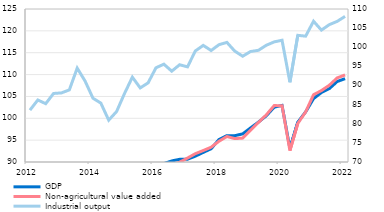
| Category | GDP | Non-agricultural value added |
|---|---|---|
| 2012 | 84.024 | 84.494 |
| II | 85.251 | 85.857 |
| III | 84.299 | 84.659 |
| IV | 84.139 | 84.858 |
| 2013 | 86.026 | 86.24 |
| II | 86.173 | 85.95 |
| III | 87.889 | 88.328 |
| IV | 87.227 | 87.378 |
| 2014 | 86.15 | 86.04 |
| II | 85.49 | 85.033 |
| III | 84.574 | 84.08 |
| IV | 85.877 | 85.282 |
| 2015 | 86.251 | 86.137 |
| II | 87.022 | 86.937 |
| III | 86.911 | 87.029 |
| IV | 87.906 | 88.071 |
| 2016 | 89.156 | 88.746 |
| II | 89.647 | 89.092 |
| III | 90.243 | 89.356 |
| IV | 90.611 | 89.952 |
| 2017 | 90.63 | 90.897 |
| II | 91.344 | 91.908 |
| III | 92.197 | 92.623 |
| IV | 93.033 | 93.385 |
| 2018 | 95.145 | 94.758 |
| II | 96.029 | 95.834 |
| III | 96.021 | 95.353 |
| IV | 96.431 | 95.466 |
| 2019 | 97.789 | 97.287 |
| II | 99.113 | 99.042 |
| III | 100.562 | 100.773 |
| IV | 102.537 | 102.897 |
| 2020 | 102.944 | 102.894 |
| II | 93.083 | 92.606 |
| III | 99.099 | 98.825 |
| IV | 101.471 | 101.464 |
| 2021 | 104.493 | 105.387 |
| II | 105.895 | 106.341 |
| III | 106.788 | 107.556 |
| IV | 108.412 | 109.237 |
| 2022 | 109.067 | 109.918 |